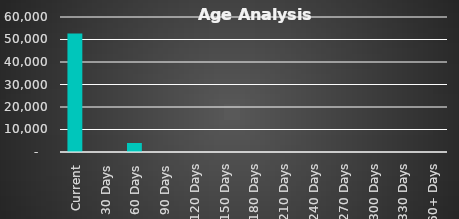
| Category |  Balance  |
|---|---|
| Current | 52649.76 |
| 30 Days | 0 |
| 60 Days | 4000 |
| 90 Days | 0 |
| 120 Days | 0 |
| 150 Days | 0 |
| 180 Days | 0 |
| 210 Days | 0 |
| 240 Days | 0 |
| 270 Days | 0 |
| 300 Days | 0 |
| 330 Days | 0 |
| 360+ Days | 0 |